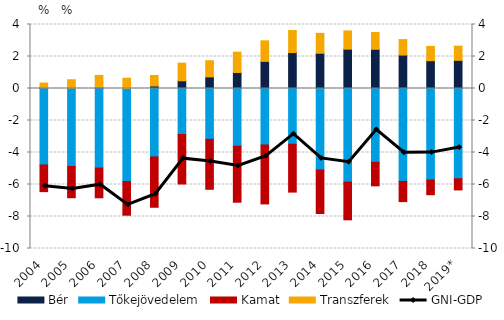
| Category | Bér | Tőkejövedelem | Kamat | Transzferek |
|---|---|---|---|---|
| 2004 | 0.05 | -4.781 | -1.665 | 0.291 |
| 2005 | 0.026 | -4.876 | -1.95 | 0.52 |
| 2006 | 0.074 | -4.974 | -1.855 | 0.743 |
| 2007 | 0.004 | -5.816 | -2.103 | 0.638 |
| 2008 | 0.158 | -4.278 | -3.144 | 0.657 |
| 2009 | 0.48 | -2.874 | -3.096 | 1.104 |
| 2010 | 0.725 | -3.179 | -3.12 | 1.012 |
| 2011 | 0.998 | -3.607 | -3.501 | 1.269 |
| 2012 | 1.693 | -3.53 | -3.684 | 1.286 |
| 2013 | 2.245 | -3.481 | -2.994 | 1.377 |
| 2014 | 2.202 | -5.098 | -2.716 | 1.245 |
| 2015 | 2.458 | -5.851 | -2.356 | 1.142 |
| 2016 | 2.449 | -4.612 | -1.472 | 1.049 |
| 2017 | 2.089 | -5.808 | -1.262 | 0.967 |
| 2018 | 1.736 | -5.715 | -0.924 | 0.895 |
| 2019* | 1.759 | -5.64 | -0.698 | 0.887 |